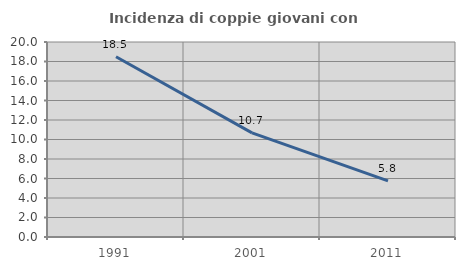
| Category | Incidenza di coppie giovani con figli |
|---|---|
| 1991.0 | 18.49 |
| 2001.0 | 10.685 |
| 2011.0 | 5.758 |